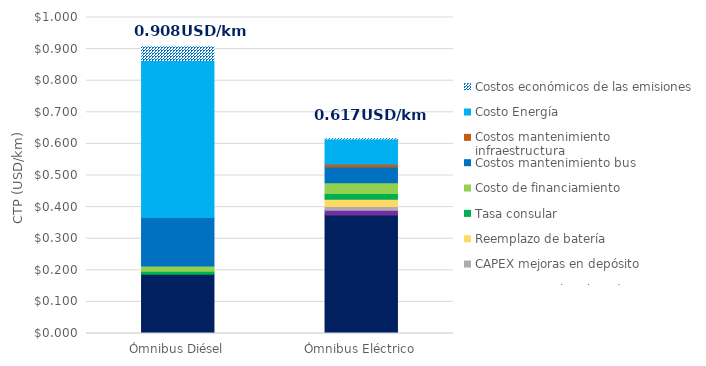
| Category | CAPEX bus | CAPEX infraestructura de carga | CAPEX conexión a la red | CAPEX mejoras en depósito | Reemplazo de batería | Tasa consular | Costo de financiamiento | Costos mantenimiento bus | Costos mantenimiento infraestructura | Costo Energía | Costos económicos de las emisiones |
|---|---|---|---|---|---|---|---|---|---|---|---|
| Ómnibus Diésel | 0.188 | 0 | 0 | 0 | 0 | 0.009 | 0.017 | 0.154 | 0 | 0.497 | 0.044 |
| Ómnibus Eléctrico | 0.375 | 0.015 | 0.002 | 0.009 | 0.023 | 0.019 | 0.034 | 0.05 | 0.009 | 0.08 | 0.001 |